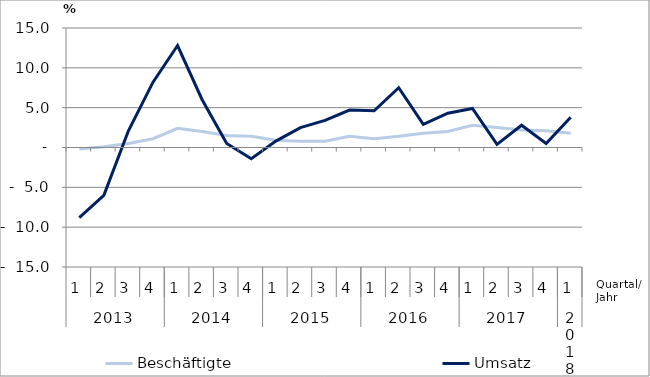
| Category | Beschäftigte | Umsatz |
|---|---|---|
| 0 | -0.2 | -8.8 |
| 1 | 0.1 | -6 |
| 2 | 0.5 | 2.1 |
| 3 | 1.1 | 8.2 |
| 4 | 2.4 | 12.8 |
| 5 | 2 | 6 |
| 6 | 1.5 | 0.5 |
| 7 | 1.4 | -1.4 |
| 8 | 0.9 | 0.8 |
| 9 | 0.8 | 2.5 |
| 10 | 0.8 | 3.4 |
| 11 | 1.4 | 4.7 |
| 12 | 1.1 | 4.6 |
| 13 | 1.4 | 7.5 |
| 14 | 1.8 | 2.9 |
| 15 | 2 | 4.3 |
| 16 | 2.8 | 4.9 |
| 17 | 2.5 | 0.4 |
| 18 | 2.2 | 2.8 |
| 19 | 2.1 | 0.5 |
| 20 | 1.8 | 3.8 |